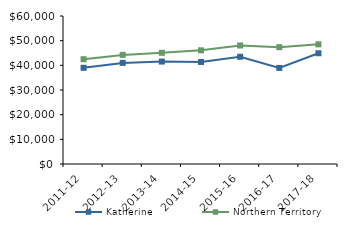
| Category | Katherine | Northern Territory |
|---|---|---|
| 2011-12 | 39000.35 | 42481 |
| 2012-13 | 40989.65 | 44232.02 |
| 2013-14 | 41532 | 45075.51 |
| 2014-15 | 41366 | 46083.65 |
| 2015-16 | 43470.05 | 48046.27 |
| 2016-17 | 38944.39 | 47367.05 |
| 2017-18 | 44906 | 48519 |